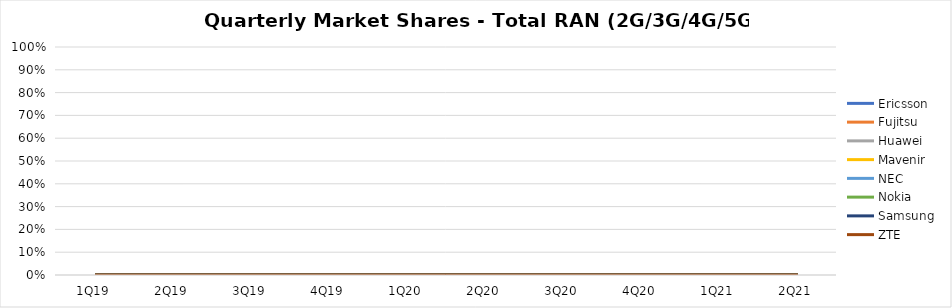
| Category | Ericsson | Fujitsu | Huawei | Mavenir | NEC | Nokia | Samsung | ZTE |
|---|---|---|---|---|---|---|---|---|
| 1Q19 | 0 | 0 | 0 | 0 | 0 | 0 | 0 | 0 |
| 2Q19 | 0 | 0 | 0 | 0 | 0 | 0 | 0 | 0 |
| 3Q19 | 0 | 0 | 0 | 0 | 0 | 0 | 0 | 0 |
| 4Q19 | 0 | 0 | 0 | 0 | 0 | 0 | 0 | 0 |
| 1Q20 | 0 | 0 | 0 | 0 | 0 | 0 | 0 | 0 |
| 2Q20 | 0 | 0 | 0 | 0 | 0 | 0 | 0 | 0 |
| 3Q20 | 0 | 0 | 0 | 0 | 0 | 0 | 0 | 0 |
| 4Q20 | 0 | 0 | 0 | 0 | 0 | 0 | 0 | 0 |
| 1Q21 | 0 | 0 | 0 | 0 | 0 | 0 | 0 | 0 |
| 2Q21 | 0 | 0 | 0 | 0 | 0 | 0 | 0 | 0 |